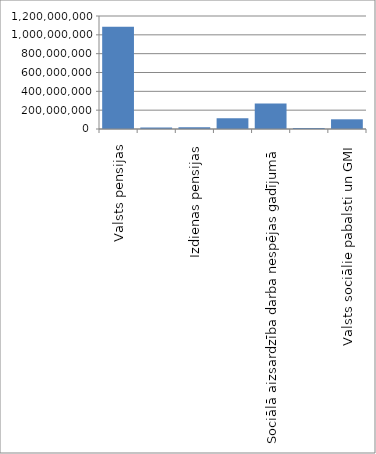
| Category | Series 0 |
|---|---|
| Valsts pensijas | 1084546833 |
| Darba aizsardzība, atbalsts sporta veterāniem, valsts budžeta transferts, | 16727422 |
| Izdienas pensijas | 19504303 |
| Atbalsts bezdarba gadījumā | 113454021 |
| Sociālā aizsardzība darba nespējas gadījumā | 272081043 |
| Atbalsts ģimenēm ar bērniem | 11249661 |
| Valsts sociālie pabalsti un GMI | 102954996 |